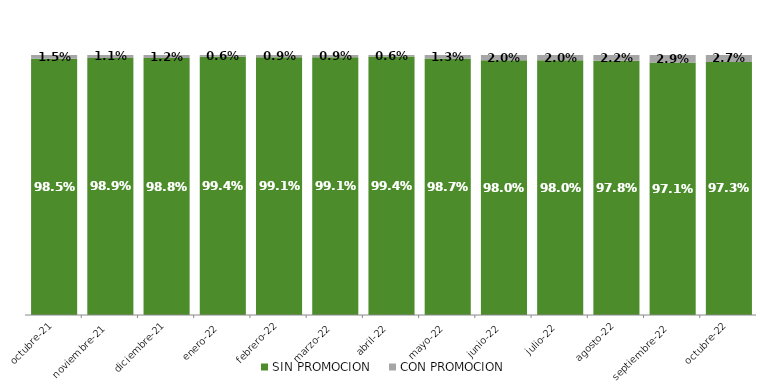
| Category | SIN PROMOCION   | CON PROMOCION   |
|---|---|---|
| 2021-10-01 | 0.985 | 0.015 |
| 2021-11-01 | 0.989 | 0.011 |
| 2021-12-01 | 0.988 | 0.012 |
| 2022-01-01 | 0.994 | 0.006 |
| 2022-02-01 | 0.991 | 0.009 |
| 2022-03-01 | 0.991 | 0.009 |
| 2022-04-01 | 0.994 | 0.006 |
| 2022-05-01 | 0.987 | 0.013 |
| 2022-06-01 | 0.98 | 0.02 |
| 2022-07-01 | 0.98 | 0.02 |
| 2022-08-01 | 0.978 | 0.022 |
| 2022-09-01 | 0.971 | 0.029 |
| 2022-10-01 | 0.973 | 0.027 |